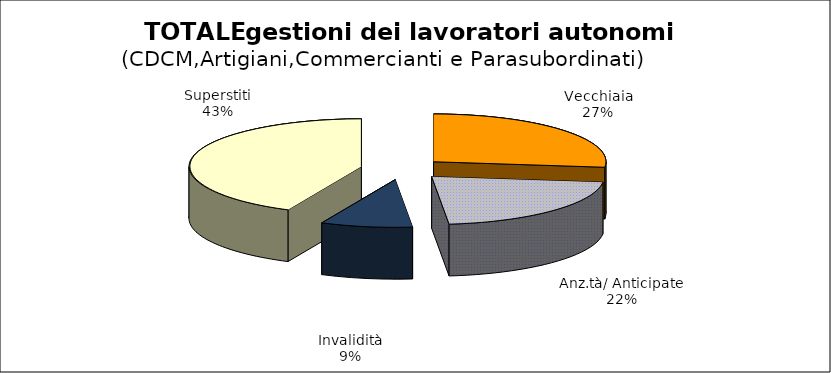
| Category | Series 0 |
|---|---|
| Vecchiaia | 28813 |
| Anz.tà/ Anticipate | 23141 |
| Invalidità | 9247 |
| Superstiti | 46162 |